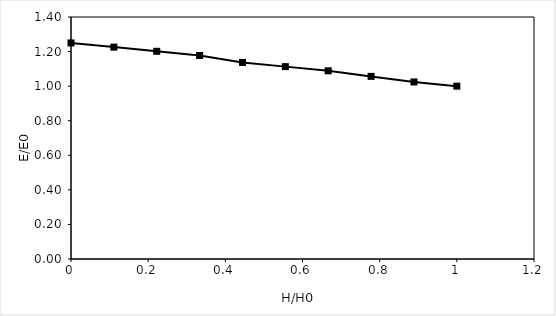
| Category | Head (feet) |
|---|---|
| 1.0 | 1 |
| 0.8888892831795598 | 1.024 |
| 0.7777785663591198 | 1.056 |
| 0.6666678495386796 | 1.089 |
| 0.5555571327182395 | 1.113 |
| 0.4444464158977994 | 1.137 |
| 0.3333356990773592 | 1.177 |
| 0.2222249822569191 | 1.202 |
| 0.11111426543647898 | 1.226 |
| 0.0 | 1.25 |